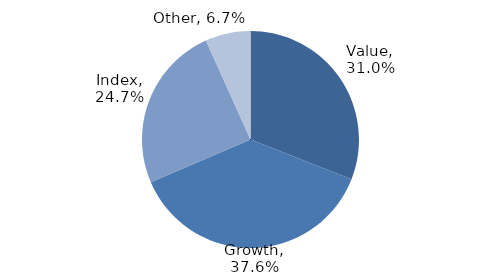
| Category | Investment Style |
|---|---|
| Value | 0.31 |
| Growth | 0.376 |
| Index | 0.247 |
| Other | 0.067 |